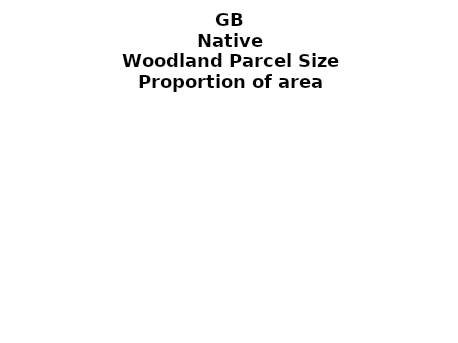
| Category | Native |
|---|---|
| <5 ha | 0.103 |
| ≥5 and <10 ha | 0.046 |
| ≥10 and <15 ha | 0.03 |
| ≥15 and <20 ha | 0.02 |
| ≥20 and <25 ha | 0.017 |
| ≥25 and <30 ha | 0.015 |
| ≥30 and <35 ha | 0.014 |
| ≥35 and <40 ha | 0.009 |
| ≥40 and <45 ha | 0.009 |
| ≥45 and <50 ha | 0.008 |
| ≥50 and <60 ha | 0.016 |
| ≥60 and <70 ha | 0.012 |
| ≥70 and <80 ha | 0.011 |
| ≥80 and <90 ha | 0.009 |
| ≥90 and <100 ha | 0.009 |
| ≥100 and <150 ha | 0.028 |
| ≥150 and <200 ha | 0.019 |
| ≥200 ha | 0.119 |